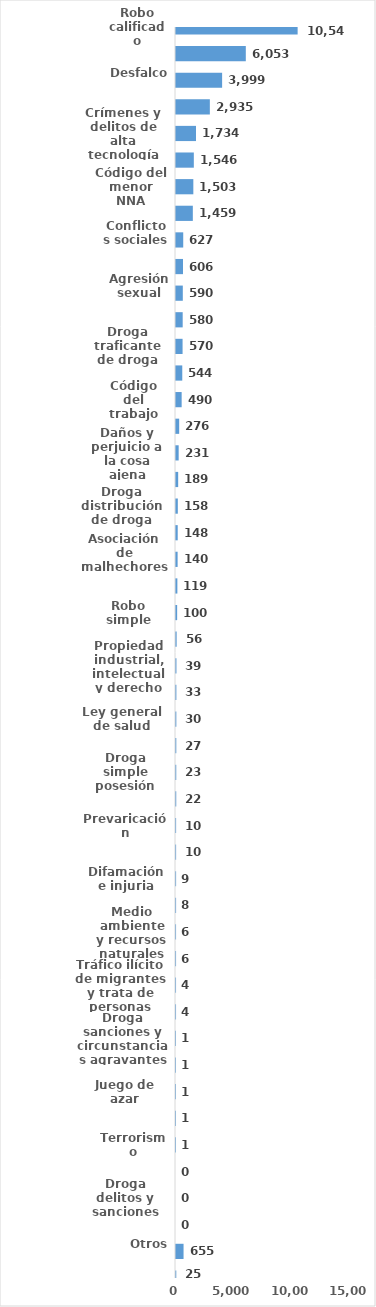
| Category | Series 0 |
|---|---|
| Robo calificado | 10546 |
| Violencia intrafamiliar | 6053 |
| Desfalco | 3999 |
| Golpes y heridas | 2935 |
| Crímenes y delitos de alta tecnología | 1734 |
| Violencia de género | 1546 |
| Código del menor NNA | 1503 |
| Amenaza | 1459 |
| Conflictos sociales | 627 |
| Abuso de confianza | 606 |
| Agresión sexual | 590 |
| Estafa | 580 |
| Droga traficante de droga | 570 |
| Perdida de documento de identidad | 544 |
| Código del trabajo | 490 |
| Falsificación | 276 |
| Daños y perjuicio a la cosa ajena | 231 |
| Ley de Armas | 189 |
| Droga distribución de droga | 158 |
| Desaparición | 148 |
| Asociación de malhechores | 140 |
| Homicidio | 119 |
| Robo simple | 100 |
| Tentativa de homicidio | 56 |
| Propiedad industrial, intelectual y derecho de autor | 39 |
| Crímenes y delitos contra la propiedad | 33 |
| Ley general de salud | 30 |
| Protección Animal y Tenencia Responsable | 27 |
| Droga simple posesión | 23 |
| Tránsito y seguridad vial  | 22 |
| Prevaricación | 10 |
| Ley de cheque | 10 |
| Difamación e injuria | 9 |
| Secuestro | 8 |
| Medio ambiente y recursos naturales | 6 |
| Contra el lavado de activo  | 6 |
| Tráfico ilícito de migrantes y trata de personas | 4 |
| Derechos humano | 4 |
| Droga sanciones y circunstancias agravantes | 1 |
| Violación sexual | 1 |
| Juego de azar | 1 |
| Proxeneta | 1 |
| Terrorismo | 1 |
| Soborno | 0 |
| Droga delitos y sanciones | 0 |
| Aborto y tentativa | 0 |
| Otros | 655 |
| Indeterminados | 25 |